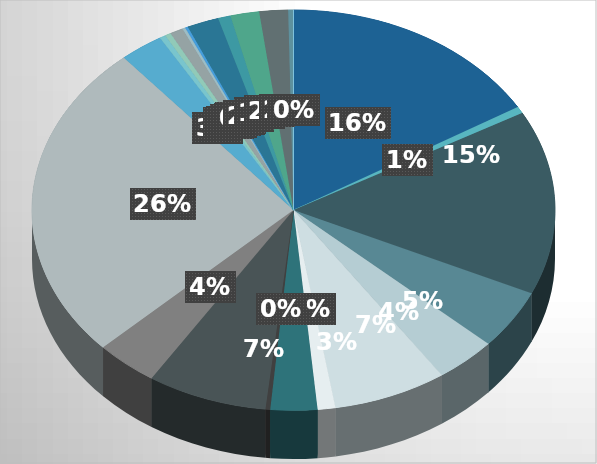
| Category | Series 0 |
|---|---|
| Agriculture, Forestry and Fishing | 1627575.043 |
| Mining and Quarrying | 10381.687 |
| Manufacturing: Food, Beverages & Tobaco | 816884.77 |
| Manufacturing: Chemicals | 282009.062 |
| Manufacturing: Rubber and Plastic | 168213.664 |
| Manufacturing: Metals | 362287.417 |
| Manufacturing: Other | 17495.631 |
| Electricity, Gas, Steam and Air Conditioning Supply | 39554.777 |
| Water Supply, Sewerage, Waste Management and Remediation Activities | 582.899 |
| Construction | 325801.905 |
| Wholesale and Retail Trade | 134735.772 |
| Transportation and Storage | 710223.103 |
| Accommodation and Food Service Activities | 126530.341 |
| Information and Communication | 2144.101 |
| Financial and Insurance Activities | 8357.8 |
| Real Estate Activities | 22041.209 |
| Professional, Scientific and Technical Activities | 3343.909 |
| Administrative and Support Service Activities | 5669.975 |
| Public Administration and Defence, Compulsory Social Security | 0 |
| Education | 33809.417 |
| Human Health and Social Work Activities | 91587.704 |
| Arts, Entertainment and Recreation | 29009.244 |
| Other Service Activities | 10483.514 |
| Activities of Households as Employers | 0 |
| Activities of Extraterritorial Organisations and Bodies | 0 |